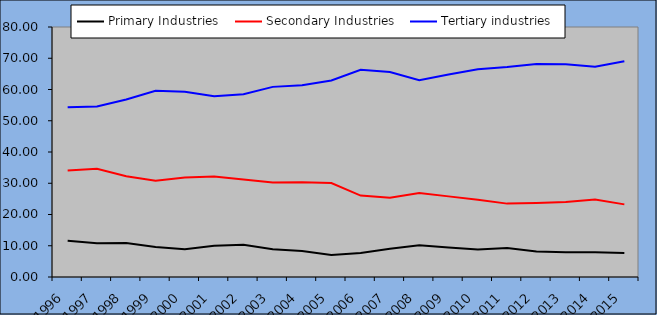
| Category | Primary Industries | Secondary Industries | Tertiary industries |
|---|---|---|---|
| 1996.0 | 11.617 | 34.087 | 54.296 |
| 1997.0 | 10.8 | 34.619 | 54.581 |
| 1998.0 | 10.914 | 32.259 | 56.827 |
| 1999.0 | 9.589 | 30.841 | 59.57 |
| 2000.0 | 8.872 | 31.856 | 59.271 |
| 2001.0 | 10.024 | 32.138 | 57.838 |
| 2002.0 | 10.331 | 31.196 | 58.473 |
| 2003.0 | 8.914 | 30.244 | 60.841 |
| 2004.0 | 8.302 | 30.315 | 61.383 |
| 2005.0 | 7.074 | 30.048 | 62.878 |
| 2006.0 | 7.678 | 26.042 | 66.281 |
| 2007.0 | 9.028 | 25.348 | 65.624 |
| 2008.0 | 10.17 | 26.884 | 62.946 |
| 2009.0 | 9.405 | 25.802 | 64.792 |
| 2010.0 | 8.805 | 24.715 | 66.479 |
| 2011.0 | 9.314 | 23.481 | 67.204 |
| 2012.0 | 8.189 | 23.653 | 68.156 |
| 2013.0 | 7.894 | 23.992 | 68.112 |
| 2014.0 | 7.932 | 24.759 | 67.307 |
| 2015.0 | 7.682 | 23.243 | 69.073 |